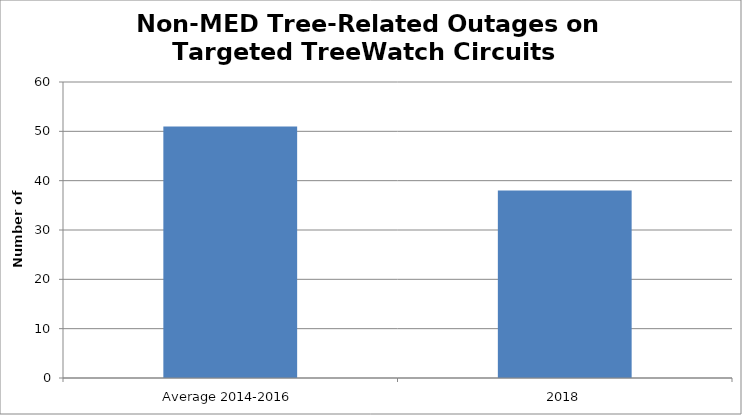
| Category | Number of Outages |
|---|---|
| Average 2014-2016 | 51 |
| 2018 | 38 |